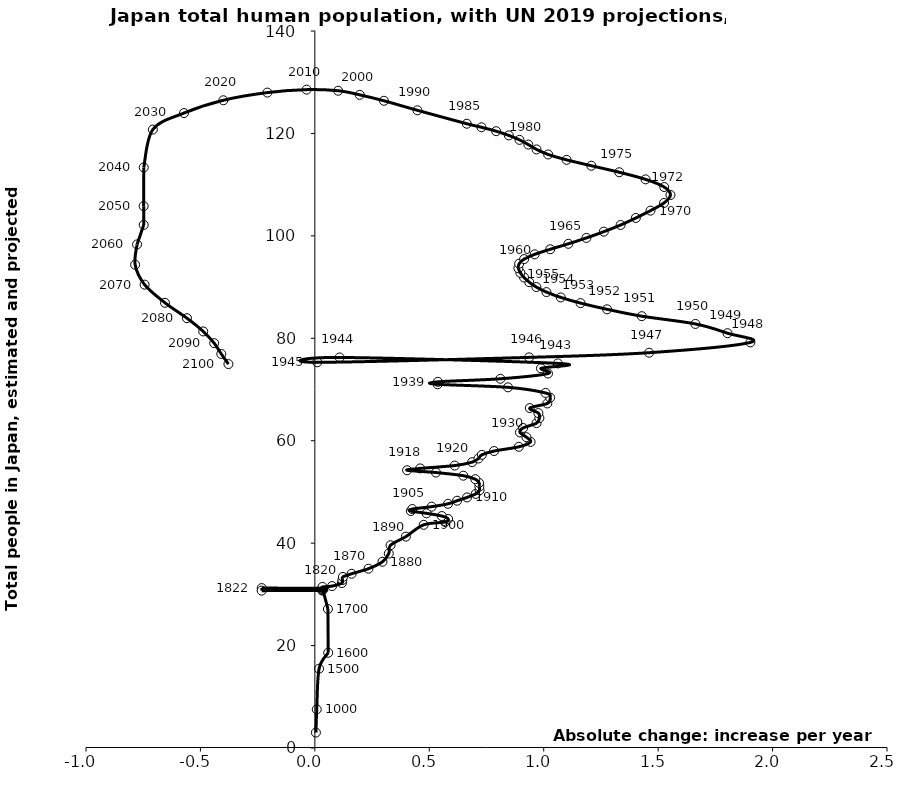
| Category | Series 0 |
|---|---|
| 0.004522913264062901 | 3.015 |
| 0.008314302049422573 | 7.538 |
| 0.018426683668404407 | 15.478 |
| 0.058295326514588484 | 18.594 |
| 0.057107490707864916 | 27.137 |
| 0.03349883335630621 | 31.158 |
| 0.033008956801246825 | 31.191 |
| -0.23222845102562495 | 31.224 |
| -0.23247434615123197 | 30.726 |
| 0.03255185772215263 | 30.759 |
| 0.0326554186294293 | 30.791 |
| 0.032759357926256526 | 30.955 |
| 0.03293316185338959 | 31.119 |
| 0.03310788789276735 | 31.284 |
| 0.03328354093662824 | 31.45 |
| 0.07523511268784588 | 31.617 |
| 0.1181828588214561 | 32.203 |
| 0.12037140350686784 | 32.799 |
| 0.12260047630174639 | 33.406 |
| 0.16056698970082978 | 34.025 |
| 0.23416352246286037 | 35.012 |
| 0.29552029353857134 | 36.366 |
| 0.323086379094326 | 37.967 |
| 0.33079302666905336 | 39.597 |
| 0.3977815786647575 | 41.275 |
| 0.4754079390648928 | 43.575 |
| 0.569106282441382 | 44.127 |
| 0.5824447109360982 | 44.713 |
| 0.5547798222063136 | 45.292 |
| 0.4880876797327147 | 45.823 |
| 0.41941947377841515 | 46.269 |
| 0.4258416800906879 | 46.662 |
| 0.5103183938905786 | 47.12 |
| 0.5819506950659274 | 47.682 |
| 0.621471964679909 | 48.284 |
| 0.6649453612552918 | 48.925 |
| 0.7029845832587576 | 49.614 |
| 0.7197811228447009 | 50.331 |
| 0.7187930911043452 | 51.054 |
| 0.7173110434938259 | 51.769 |
| 0.7010085197780604 | 52.488 |
| 0.6486428375395263 | 53.171 |
| 0.5290909969572191 | 53.785 |
| 0.4031169500626426 | 54.229 |
| 0.4604227910029266 | 54.592 |
| 0.611097631406242 | 55.15 |
| 0.6871760754131593 | 55.814 |
| 0.714840964142951 | 56.524 |
| 0.7296614402481936 | 57.244 |
| 0.7830151542270762 | 57.984 |
| 0.8912046297953644 | 58.81 |
| 0.9425822802935357 | 59.766 |
| 0.9243036930970696 | 60.695 |
| 0.8961447884971072 | 61.615 |
| 0.9099772328619977 | 62.487 |
| 0.9687651214128081 | 63.435 |
| 0.9811155181671758 | 64.425 |
| 0.9766693753355966 | 65.397 |
| 0.9391241692023158 | 66.378 |
| 1.0156966290794145 | 67.275 |
| 1.0280470258337857 | 68.409 |
| 1.0077923751566118 | 69.331 |
| 0.843779106258566 | 70.425 |
| 0.5365012350098439 | 71.019 |
| 0.5374892667501925 | 71.498 |
| 0.8106800429568608 | 72.094 |
| 1.0186607243004602 | 73.119 |
| 0.9880317403496193 | 74.131 |
| 1.0616401050056723 | 75.095 |
| 0.10818947556828107 | 76.254 |
| 0.010374333273666991 | 75.312 |
| 0.9361600739812701 | 76.275 |
| 1.4603109122367428 | 77.184 |
| 1.902949131913374 | 79.196 |
| 1.8031999261380562 | 80.99 |
| 1.6628256059006006 | 82.802 |
| 1.4282995000000014 | 84.316 |
| 1.276912000000003 | 85.659 |
| 1.1608175000000003 | 86.869 |
| 1.0744159999999994 | 87.98 |
| 1.0119974999999997 | 89.018 |
| 0.9678484999999952 | 90.004 |
| 0.936695499999999 | 90.954 |
| 0.9141350000000017 | 91.878 |
| 0.8979555000000019 | 92.782 |
| 0.8893105000000006 | 93.674 |
| 0.8926330000000036 | 94.561 |
| 0.9145540000000025 | 95.459 |
| 0.9604834999999952 | 96.39 |
| 1.028524499999996 | 97.38 |
| 1.1076400000000035 | 98.447 |
| 1.1865094999999997 | 99.595 |
| 1.2626769999999965 | 100.82 |
| 1.3359544999999997 | 102.12 |
| 1.4025815000000037 | 103.492 |
| 1.4666695000000018 | 104.926 |
| 1.525697000000001 | 106.425 |
| 1.5538044999999983 | 107.977 |
| 1.5265509999999978 | 109.533 |
| 1.4450885000000042 | 111.03 |
| 1.3299834999999973 | 112.423 |
| 1.2080324999999945 | 113.69 |
| 1.1000879999999995 | 114.839 |
| 1.0194530000000057 | 115.89 |
| 0.9685355000000015 | 116.878 |
| 0.9325769999999949 | 117.827 |
| 0.8941344999999998 | 118.743 |
| 0.8474535000000003 | 119.616 |
| 0.7920875000000009 | 120.438 |
| 0.7279754999999994 | 121.2 |
| 0.6638634999999979 | 121.894 |
| 0.44814280000000084 | 124.516 |
| 0.3018372999999997 | 126.375 |
| 0.19603010000000012 | 127.534 |
| 0.10179389999999984 | 128.336 |
| -0.036080900000000325 | 128.552 |
| -0.20754119999999573 | 127.975 |
| -0.39989760000000557 | 126.476 |
| -0.5718403999999992 | 123.976 |
| -0.7079670666666601 | 120.758 |
| -0.7477015000000022 | 113.356 |
| -0.7480996666666707 | 105.804 |
| -0.747822099999999 | 102.135 |
| -0.7768715999999941 | 98.326 |
| -0.7853450000000024 | 94.366 |
| -0.7439325000000026 | 90.472 |
| -0.6547793000000013 | 86.927 |
| -0.5588524999999975 | 83.925 |
| -0.48774399999999074 | 81.338 |
| -0.43992839999999944 | 79.047 |
| -0.40877460000000526 | 76.939 |
| -0.3776208000000111 | 74.959 |